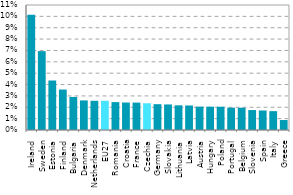
| Category | Series 0 |
|---|---|
| Ireland | 0.101 |
| Sweden | 0.069 |
| Estonia | 0.044 |
| Finland | 0.036 |
| Bulgaria | 0.029 |
| Denmark | 0.026 |
| Netherlands | 0.026 |
| EU27 | 0.026 |
| Romania | 0.025 |
| Croatia | 0.024 |
| France | 0.024 |
| Czechia | 0.024 |
| Germany | 0.023 |
| Slovakia | 0.022 |
| Lithuania | 0.022 |
| Latvia | 0.022 |
| Austria | 0.021 |
| Hungary | 0.02 |
| Poland | 0.02 |
| Portugal | 0.02 |
| Belgium | 0.02 |
| Slovenia | 0.018 |
| Spain | 0.017 |
| Italy | 0.017 |
| Greece | 0.009 |